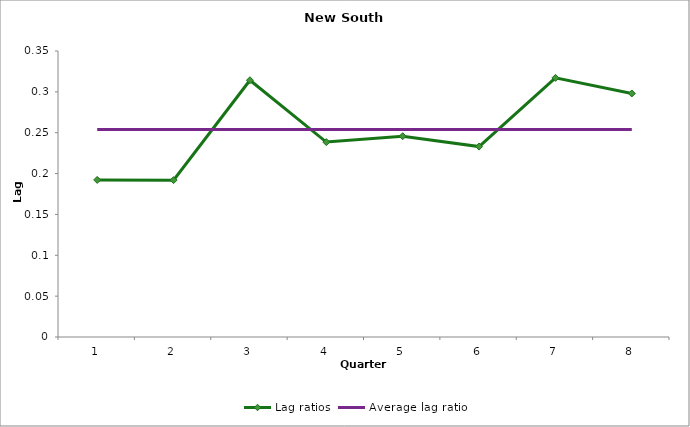
| Category | Lag ratios | Average lag ratio |
|---|---|---|
| 0 | 0.192 | 0.254 |
| 1 | 0.192 | 0.254 |
| 2 | 0.314 | 0.254 |
| 3 | 0.239 | 0.254 |
| 4 | 0.246 | 0.254 |
| 5 | 0.233 | 0.254 |
| 6 | 0.317 | 0.254 |
| 7 | 0.298 | 0.254 |